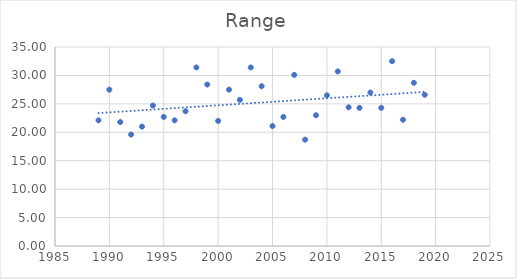
| Category | Range |
|---|---|
| 1989.0 | 22.1 |
| 1990.0 | 27.5 |
| 1991.0 | 21.8 |
| 1992.0 | 19.6 |
| 1993.0 | 21 |
| 1994.0 | 24.7 |
| 1995.0 | 22.7 |
| 1996.0 | 22.1 |
| 1997.0 | 23.7 |
| 1998.0 | 31.4 |
| 1999.0 | 28.4 |
| 2000.0 | 22 |
| 2001.0 | 27.5 |
| 2002.0 | 25.7 |
| 2003.0 | 31.4 |
| 2004.0 | 28.1 |
| 2005.0 | 21.1 |
| 2006.0 | 22.7 |
| 2007.0 | 30.1 |
| 2008.0 | 18.7 |
| 2009.0 | 23 |
| 2010.0 | 26.5 |
| 2011.0 | 30.7 |
| 2012.0 | 24.4 |
| 2013.0 | 24.3 |
| 2014.0 | 27 |
| 2015.0 | 24.3 |
| 2016.0 | 32.5 |
| 2017.0 | 22.2 |
| 2018.0 | 28.7 |
| 2019.0 | 26.6 |